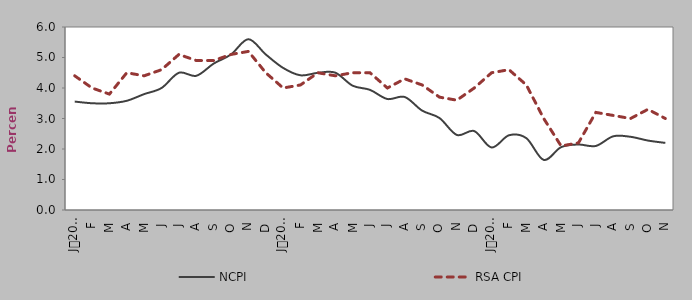
| Category | NCPI | RSA CPI |
|---|---|---|
| 0 | 3.555 | 4.4 |
| 1900-01-01 | 3.5 | 4 |
| 1900-01-02 | 3.5 | 3.8 |
| 1900-01-03 | 3.581 | 4.5 |
| 1900-01-04 | 3.8 | 4.4 |
| 1900-01-05 | 4 | 4.6 |
| 1900-01-06 | 4.5 | 5.1 |
| 1900-01-07 | 4.4 | 4.9 |
| 1900-01-08 | 4.8 | 4.9 |
| 1900-01-09 | 5.1 | 5.1 |
| 1900-01-10 | 5.6 | 5.2 |
| 1900-01-11 | 5.1 | 4.5 |
| 1900-01-12 | 4.658 | 4 |
| 1900-01-13 | 4.416 | 4.1 |
| 1900-01-14 | 4.498 | 4.5 |
| 1900-01-15 | 4.503 | 4.4 |
| 1900-01-16 | 4.076 | 4.5 |
| 1900-01-17 | 3.939 | 4.5 |
| 1900-01-18 | 3.639 | 4 |
| 1900-01-19 | 3.705 | 4.3 |
| 1900-01-20 | 3.259 | 4.1 |
| 1900-01-21 | 3.015 | 3.7 |
| 1900-01-22 | 2.461 | 3.6 |
| 1900-01-23 | 2.588 | 4 |
| 1900-01-24 | 2.05 | 4.5 |
| 1900-01-25 | 2.45 | 4.6 |
| 1900-01-26 | 2.354 | 4.1 |
| 1900-01-27 | 1.643 | 3 |
| 1900-01-28 | 2.06 | 2.1 |
| 1900-01-29 | 2.147 | 2.2 |
| 1900-01-30 | 2.1 | 3.2 |
| 1900-01-31 | 2.416 | 3.1 |
| 1900-02-01 | 2.4 | 3 |
| 1900-02-02 | 2.277 | 3.3 |
| 1900-02-03 | 2.2 | 3 |